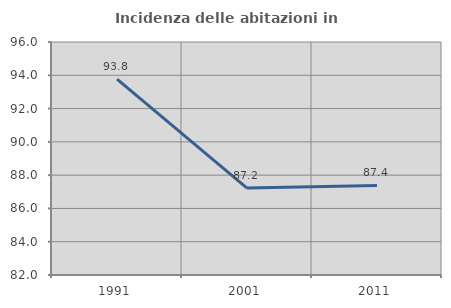
| Category | Incidenza delle abitazioni in proprietà  |
|---|---|
| 1991.0 | 93.772 |
| 2001.0 | 87.22 |
| 2011.0 | 87.385 |